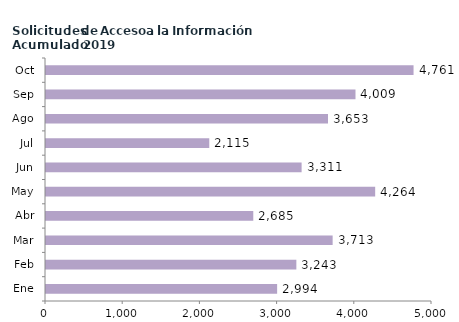
| Category | Series 0 |
|---|---|
| Ene | 2994 |
| Feb | 3243 |
| Mar | 3713 |
| Abr | 2685 |
| May | 4264 |
| Jun | 3311 |
| Jul | 2115 |
| Ago | 3653 |
| Sep | 4009 |
| Oct | 4761 |